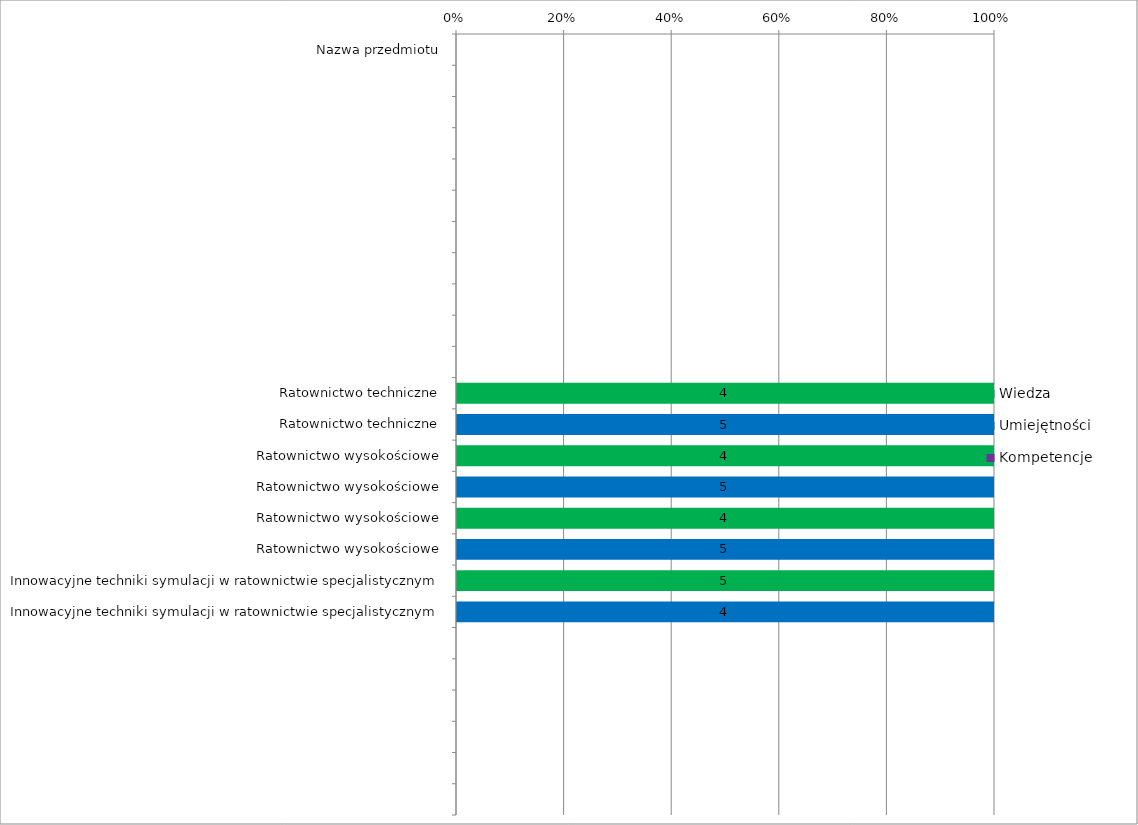
| Category | Wiedza | Umiejętności | Kompetencje |
|---|---|---|---|
| Nazwa przedmiotu | 0 | 0 | 0 |
|  | 0 | 0 | 0 |
|  | 0 | 0 | 0 |
|  | 0 | 0 | 0 |
|  | 0 | 0 | 0 |
|  | 0 | 0 | 0 |
|  | 0 | 0 | 0 |
|  | 0 | 0 | 0 |
|  | 0 | 0 | 0 |
|  | 0 | 0 | 0 |
|  | 0 | 0 | 0 |
| Ratownictwo techniczne | 4 | 0 | 0 |
| Ratownictwo techniczne | 0 | 5 | 0 |
| Ratownictwo wysokościowe | 4 | 0 | 0 |
| Ratownictwo wysokościowe | 0 | 5 | 0 |
| Ratownictwo wysokościowe | 4 | 0 | 0 |
| Ratownictwo wysokościowe | 0 | 5 | 0 |
| Innowacyjne techniki symulacji w ratownictwie specjalistycznym | 5 | 0 | 0 |
| Innowacyjne techniki symulacji w ratownictwie specjalistycznym | 0 | 4 | 0 |